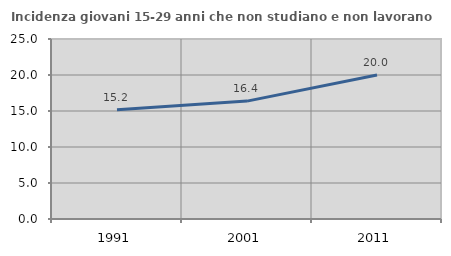
| Category | Incidenza giovani 15-29 anni che non studiano e non lavorano  |
|---|---|
| 1991.0 | 15.179 |
| 2001.0 | 16.374 |
| 2011.0 | 20 |